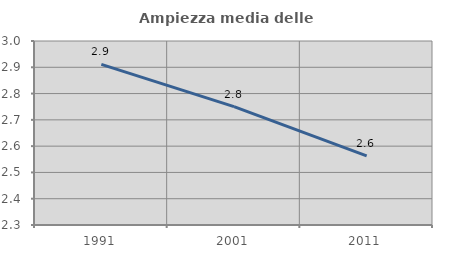
| Category | Ampiezza media delle famiglie |
|---|---|
| 1991.0 | 2.911 |
| 2001.0 | 2.75 |
| 2011.0 | 2.563 |